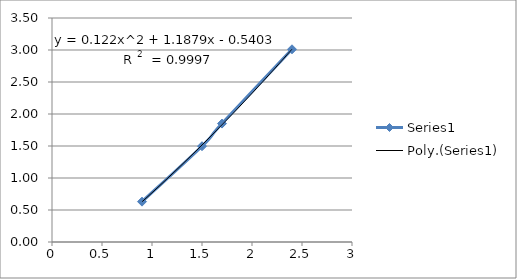
| Category | Series 0 |
|---|---|
| 0.9 | 0.631 |
| 1.5 | 1.497 |
| 1.7 | 1.85 |
| 2.4 | 3.011 |